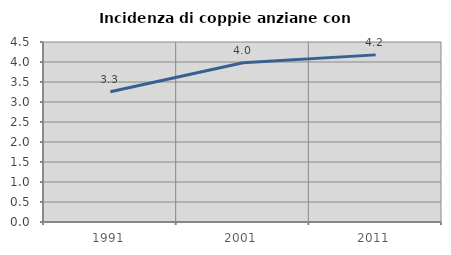
| Category | Incidenza di coppie anziane con figli |
|---|---|
| 1991.0 | 3.255 |
| 2001.0 | 3.982 |
| 2011.0 | 4.178 |